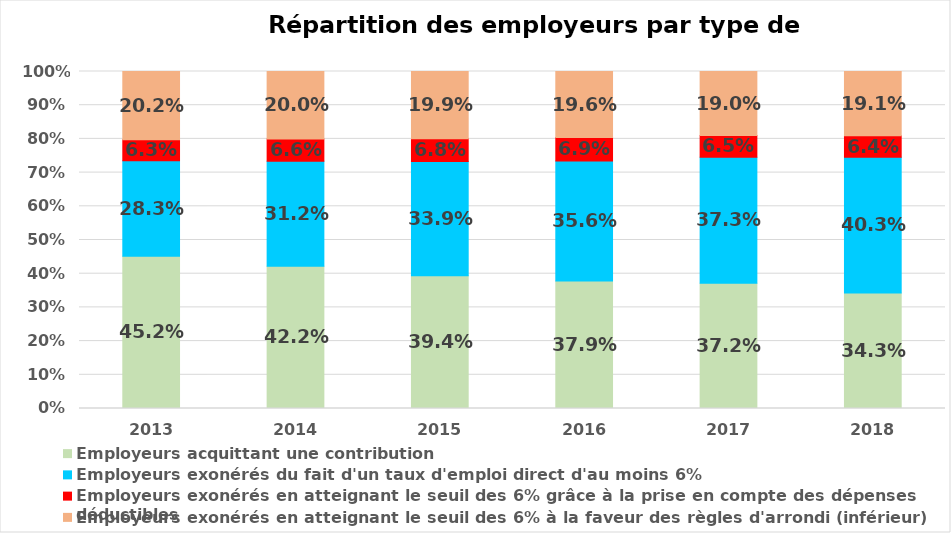
| Category | Employeurs acquittant une contribution | Employeurs exonérés du fait d'un taux d'emploi direct d'au moins 6% | Employeurs exonérés en atteignant le seuil des 6% grâce à la prise en compte des dépenses déductibles  | Employeurs exonérés en atteignant le seuil des 6% à la faveur des règles d'arrondi (inférieur) |
|---|---|---|---|---|
| 2013.0 | 0.452 | 0.283 | 0.063 | 0.202 |
| 2014.0 | 0.422 | 0.312 | 0.066 | 0.2 |
| 2015.0 | 0.394 | 0.339 | 0.068 | 0.199 |
| 2016.0 | 0.379 | 0.356 | 0.069 | 0.196 |
| 2017.0 | 0.372 | 0.373 | 0.065 | 0.19 |
| 2018.0 | 0.343 | 0.403 | 0.064 | 0.191 |